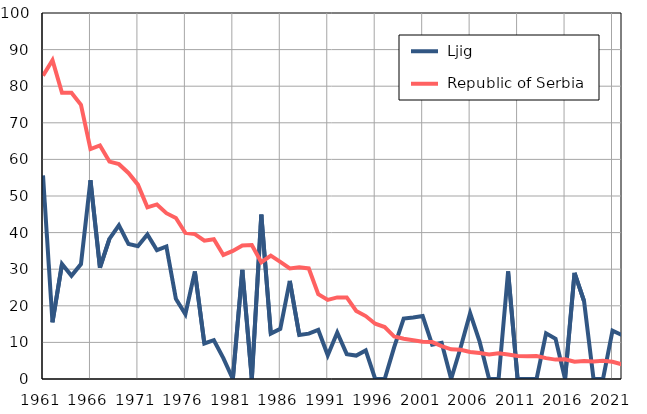
| Category |  Ljig |  Republic of Serbia |
|---|---|---|
| 1961.0 | 55.6 | 82.9 |
| 1962.0 | 15.5 | 87.1 |
| 1963.0 | 31.4 | 78.2 |
| 1964.0 | 28.2 | 78.2 |
| 1965.0 | 31.4 | 74.9 |
| 1966.0 | 54.3 | 62.8 |
| 1967.0 | 30.4 | 63.8 |
| 1968.0 | 38.3 | 59.4 |
| 1969.0 | 42 | 58.7 |
| 1970.0 | 36.9 | 56.3 |
| 1971.0 | 36.3 | 53.1 |
| 1972.0 | 39.5 | 46.9 |
| 1973.0 | 35.2 | 47.7 |
| 1974.0 | 36.2 | 45.3 |
| 1975.0 | 21.9 | 44 |
| 1976.0 | 17.7 | 39.9 |
| 1977.0 | 29.4 | 39.6 |
| 1978.0 | 9.7 | 37.8 |
| 1979.0 | 10.6 | 38.2 |
| 1980.0 | 5.7 | 33.9 |
| 1981.0 | 0 | 35 |
| 1982.0 | 29.8 | 36.5 |
| 1983.0 | 0 | 36.6 |
| 1984.0 | 44.9 | 31.9 |
| 1985.0 | 12.4 | 33.7 |
| 1986.0 | 13.7 | 32 |
| 1987.0 | 26.8 | 30.2 |
| 1988.0 | 12 | 30.5 |
| 1989.0 | 12.4 | 30.2 |
| 1990.0 | 13.4 | 23.2 |
| 1991.0 | 6.5 | 21.6 |
| 1992.0 | 12.7 | 22.3 |
| 1993.0 | 6.8 | 22.3 |
| 1994.0 | 6.4 | 18.6 |
| 1995.0 | 7.8 | 17.2 |
| 1996.0 | 0 | 15.1 |
| 1997.0 | 0 | 14.2 |
| 1998.0 | 8.7 | 11.6 |
| 1999.0 | 16.5 | 11 |
| 2000.0 | 16.8 | 10.6 |
| 2001.0 | 17.2 | 10.2 |
| 2002.0 | 9.4 | 10.1 |
| 2003.0 | 9.9 | 9 |
| 2004.0 | 0 | 8.1 |
| 2005.0 | 8.6 | 8 |
| 2006.0 | 18 | 7.4 |
| 2007.0 | 10.2 | 7.1 |
| 2008.0 | 0 | 6.7 |
| 2009.0 | 0 | 7 |
| 2010.0 | 29.4 | 6.7 |
| 2011.0 | 0 | 6.3 |
| 2012.0 | 0 | 6.2 |
| 2013.0 | 0 | 6.3 |
| 2014.0 | 12.5 | 5.7 |
| 2015.0 | 11 | 5.3 |
| 2016.0 | 0 | 5.4 |
| 2017.0 | 29 | 4.7 |
| 2018.0 | 21.3 | 4.9 |
| 2019.0 | 0 | 4.8 |
| 2020.0 | 0 | 5 |
| 2021.0 | 13.2 | 4.7 |
| 2022.0 | 12 | 4 |